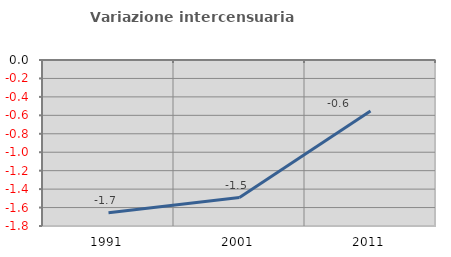
| Category | Variazione intercensuaria annua |
|---|---|
| 1991.0 | -1.655 |
| 2001.0 | -1.492 |
| 2011.0 | -0.552 |